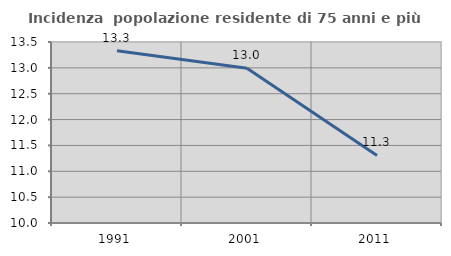
| Category | Incidenza  popolazione residente di 75 anni e più |
|---|---|
| 1991.0 | 13.33 |
| 2001.0 | 12.992 |
| 2011.0 | 11.307 |